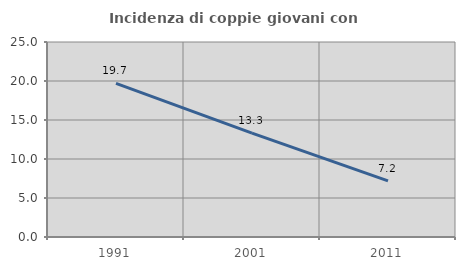
| Category | Incidenza di coppie giovani con figli |
|---|---|
| 1991.0 | 19.69 |
| 2001.0 | 13.318 |
| 2011.0 | 7.203 |